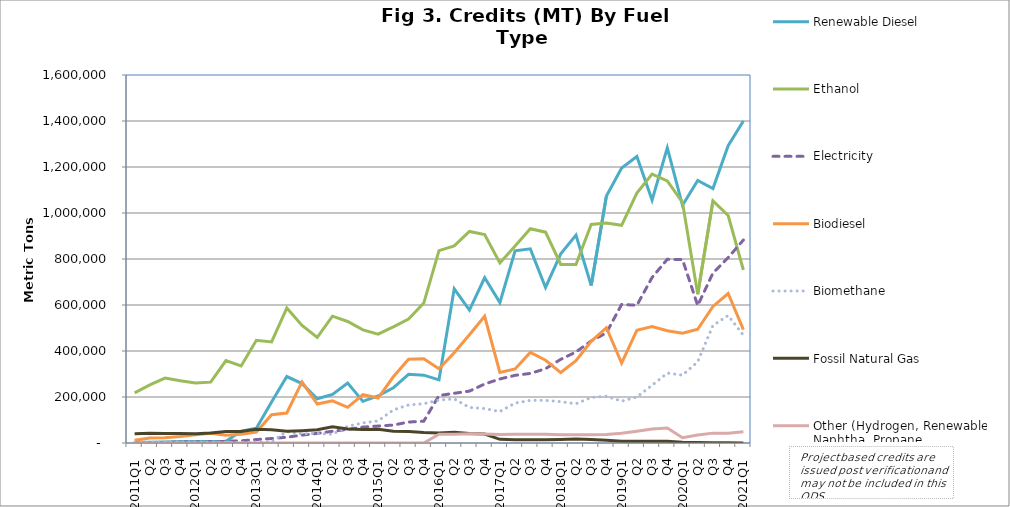
| Category | Renewable Diesel  | Ethanol | Electricity | Biodiesel | Biomethane | Fossil Natural Gas | Other (Hydrogen, Renewable Naphtha, Propane, Innovative Crude & Low Complexity / Low Energy Use Refining, etc.) |
|---|---|---|---|---|---|---|---|
| 2011Q1 | 3070 | 217913 | 459 | 12300 | 2212 | 39934 | 0 |
| Q2 | 3368 | 252550 | 1293 | 21555 | 3069 | 42169 | 0 |
| Q3 | 4362 | 282189 | 2455 | 22424 | 4960 | 41443 | 0 |
| Q4 | 6220 | 270901 | 3536 | 27988 | 4474 | 40844 | 0 |
| 2012Q1 | 6701 | 261269 | 4519 | 35382 | 4367 | 40226 | 0 |
| Q2 | 6804 | 264615 | 5560 | 41919 | 4221 | 43158 | 0 |
| Q3 | 7938 | 358459 | 7294 | 34052 | 3577 | 49942 | 0 |
| Q4 | 51216 | 334751 | 9611 | 37994 | 2680 | 49844 | 0 |
| 2013Q1 | 64445 | 446344 | 15051 | 47386 | 4240 | 59246 | 0 |
| Q2 | 178293 | 439633 | 19516 | 123072 | 5183 | 58045 | 0 |
| Q3 | 288998 | 586902 | 25039 | 130475 | 49133 | 50799 | 0 |
| Q4 | 258193 | 510999 | 34347 | 265737 | 39562 | 53765 | 0 |
| 2014Q1 | 192407 | 459238 | 41753 | 169218 | 41739 | 57641 | 0 |
| Q2 | 211004 | 551332 | 51092 | 183308 | 37894 | 70355 | 0 |
| Q3 | 260522 | 528433 | 59366 | 154934 | 72586 | 60793 | 0 |
| Q4 | 181046 | 491880 | 69119 | 210540 | 87339 | 58227 | 0 |
| 2015Q1 | 204352 | 473209 | 73708 | 195615 | 96047 | 59660 | 0 |
| Q2 | 240167 | 504542 | 78072 | 287973 | 143831 | 50678 | 0 |
| Q3 | 298591 | 538519 | 91036 | 364501 | 165388 | 49578 | 50 |
| Q4 | 295061 | 608484 | 94924 | 365821 | 170686 | 45675 | 24 |
| 2016Q1 | 274568 | 836629 | 206464 | 322607 | 186808 | 43627 | 37975 |
| Q2 | 670559 | 857168 | 216149 | 392318 | 191624 | 46616 | 38243 |
| Q3 | 577586 | 919750 | 225640 | 470922 | 154491 | 40957 | 39843 |
| Q4 | 718504 | 905839 | 256450 | 550936 | 149732 | 38991 | 39493 |
| 2017Q1 | 610652 | 783039 | 278442 | 306640 | 136721 | 16031 | 37028 |
| Q2 | 835625 | 856950 | 294201 | 321909 | 173497 | 14323 | 37617 |
| Q3 | 844159 | 931601 | 302457 | 393587 | 185321 | 14005 | 37717 |
| Q4 | 676294 | 916634 | 323014 | 359942 | 185446 | 14135 | 37644 |
| 2018Q1 | 822711 | 776336 | 363840 | 306337 | 179507 | 15292 | 35569 |
| Q2 | 904125 | 775942 | 395708 | 357508 | 170495 | 16964 | 36090 |
| Q3 | 684773 | 949941 | 443790 | 442007 | 197971 | 14909 | 36240 |
| Q4 | 1073782 | 956310 | 478635 | 501294 | 203315 | 11610 | 37400 |
| 2019Q1 | 1195556 | 946616 | 602432 | 347140 | 181925 | 8133 | 42116 |
| Q2 | 1245746 | 1086445 | 598746 | 490163 | 199915 | 7220 | 51531 |
| Q3 | 1056305 | 1169325 | 719616 | 506350 | 251067 | 8107 | 61015 |
| Q4 | 1282920 | 1139746 | 798682 | 488183 | 303885 | 7391 | 64846 |
| 2020Q1 | 1033524 | 1045825 | 797627 | 477186 | 294961 | 3785 | 22818 |
| Q2 | 1141261 | 646825 | 597638 | 494458 | 353395 | 2471 | 34548 |
| Q3 | 1106402 | 1052951 | 739192 | 593598 | 511122 | 1459 | 42895 |
| Q4 | 1292580 | 989071 | 805926 | 649972 | 554383 | 584 | 42888 |
| 2021Q1 | 1400346 | 752096 | 882663 | 493066 | 468156 | 482 | 48408 |